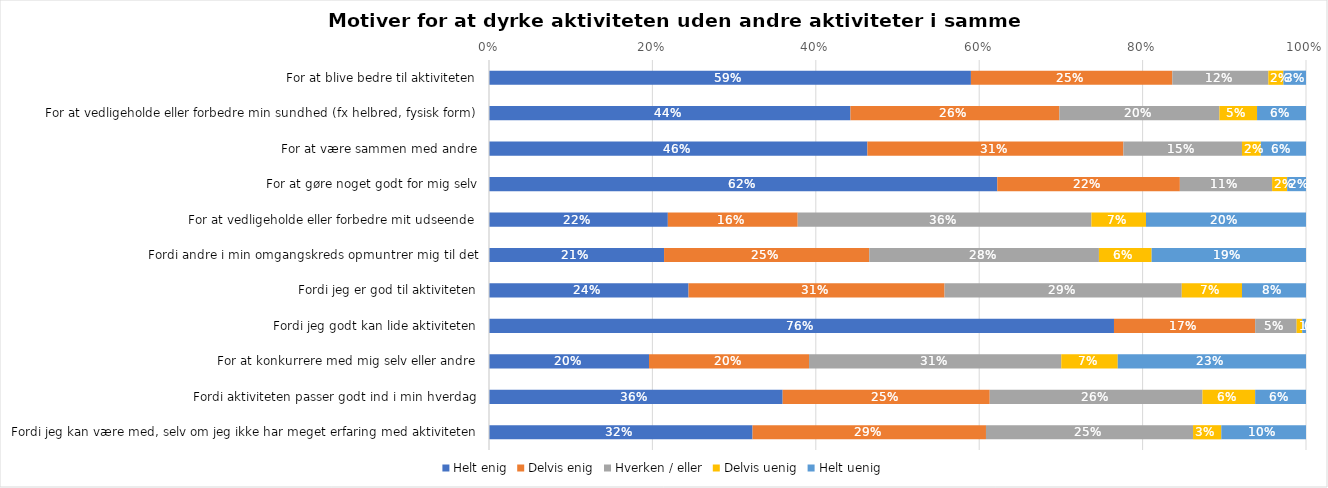
| Category | Helt enig | Delvis enig | Hverken / eller | Delvis uenig | Helt uenig |
|---|---|---|---|---|---|
| For at blive bedre til aktiviteten | 0.59 | 0.247 | 0.118 | 0.018 | 0.028 |
| For at vedligeholde eller forbedre min sundhed (fx helbred, fysisk form) | 0.442 | 0.256 | 0.196 | 0.046 | 0.06 |
| For at være sammen med andre | 0.463 | 0.313 | 0.145 | 0.023 | 0.055 |
| For at gøre noget godt for mig selv | 0.622 | 0.224 | 0.113 | 0.018 | 0.023 |
| For at vedligeholde eller forbedre mit udseende | 0.219 | 0.159 | 0.359 | 0.067 | 0.196 |
| Fordi andre i min omgangskreds opmuntrer mig til det | 0.214 | 0.251 | 0.281 | 0.065 | 0.189 |
| Fordi jeg er god til aktiviteten | 0.244 | 0.313 | 0.29 | 0.074 | 0.078 |
| Fordi jeg godt kan lide aktiviteten | 0.765 | 0.173 | 0.051 | 0.007 | 0.005 |
| For at konkurrere med mig selv eller andre | 0.196 | 0.196 | 0.309 | 0.069 | 0.23 |
| Fordi aktiviteten passer godt ind i min hverdag | 0.359 | 0.253 | 0.26 | 0.065 | 0.062 |
| Fordi jeg kan være med, selv om jeg ikke har meget erfaring med aktiviteten | 0.323 | 0.286 | 0.253 | 0.035 | 0.104 |